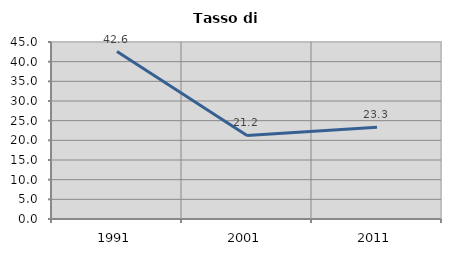
| Category | Tasso di disoccupazione   |
|---|---|
| 1991.0 | 42.574 |
| 2001.0 | 21.239 |
| 2011.0 | 23.324 |